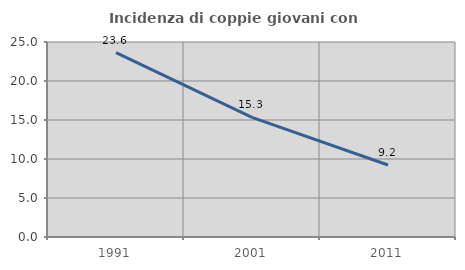
| Category | Incidenza di coppie giovani con figli |
|---|---|
| 1991.0 | 23.64 |
| 2001.0 | 15.33 |
| 2011.0 | 9.231 |